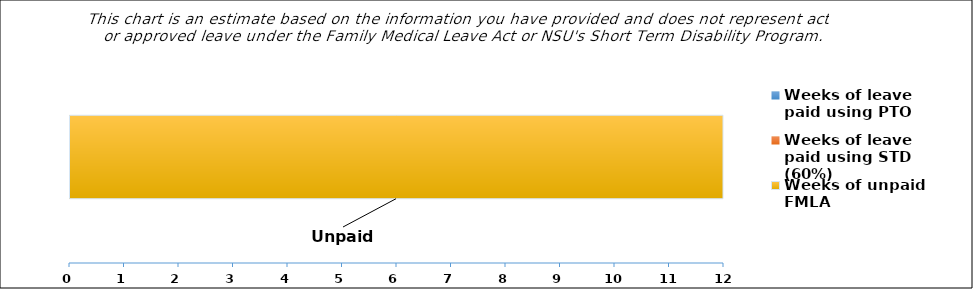
| Category | Weeks of leave paid using PTO | Weeks of leave paid using STD (60%) | Weeks of unpaid FMLA |
|---|---|---|---|
| 0 | 0 | 0 | 12 |